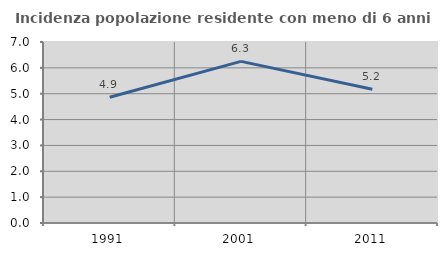
| Category | Incidenza popolazione residente con meno di 6 anni |
|---|---|
| 1991.0 | 4.866 |
| 2001.0 | 6.25 |
| 2011.0 | 5.175 |